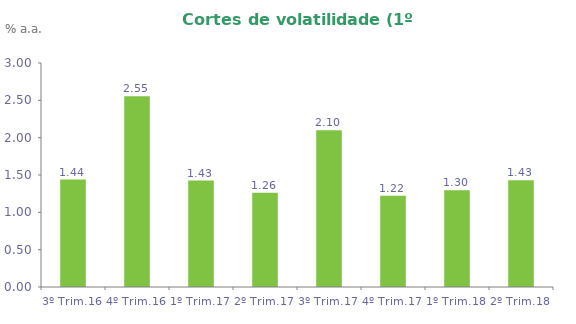
| Category | Series 0 |
|---|---|
| 3º Trim.16 | 1.44 |
| 4º Trim.16 | 2.555 |
| 1º Trim.17 | 1.426 |
| 2º Trim.17 | 1.262 |
| 3º Trim.17 | 2.1 |
| 4º Trim.17 | 1.223 |
| 1º Trim.18 | 1.296 |
| 2º Trim.18 | 1.429 |